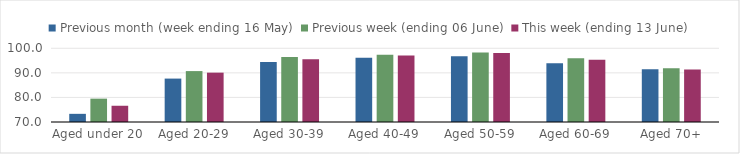
| Category | Previous month (week ending 16 May) | Previous week (ending 06 June) | This week (ending 13 June) |
|---|---|---|---|
| Aged under 20 | 73.322 | 79.503 | 76.611 |
| Aged 20-29 | 87.668 | 90.718 | 90.085 |
| Aged 30-39 | 94.416 | 96.424 | 95.535 |
| Aged 40-49 | 96.14 | 97.388 | 97.054 |
| Aged 50-59 | 96.764 | 98.263 | 98.075 |
| Aged 60-69 | 93.872 | 95.979 | 95.32 |
| Aged 70+ | 91.433 | 91.9 | 91.355 |